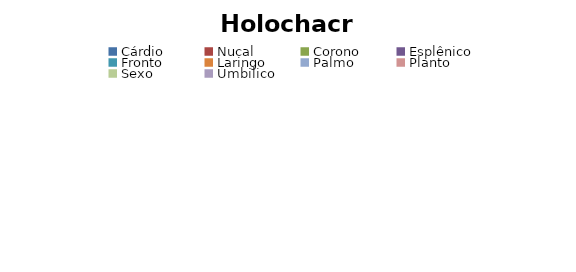
| Category | C1 | C2 | Total |
|---|---|---|---|
| Cárdio | 0 | 0 | 0 |
| Nucal | 0 | 0 | 0 |
| Corono | 0 | 0 | 0 |
| Esplênico | 0 | 0 | 0 |
| Fronto | 0 | 0 | 0 |
| Laringo | 0 | 0 | 0 |
| Palmo | 0 | 0 | 0 |
| Planto | 0 | 0 | 0 |
| Sexo | 0 | 0 | 0 |
| Umbilico | 0 | 0 | 0 |